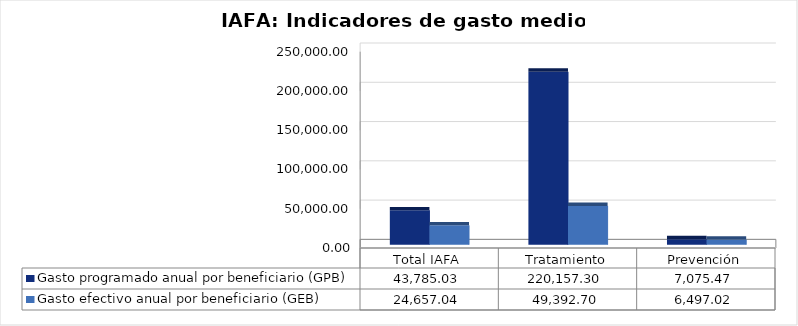
| Category | Gasto programado anual por beneficiario (GPB)  | Gasto efectivo anual por beneficiario (GEB)  |
|---|---|---|
| Total IAFA | 43785.031 | 24657.04 |
| Tratamiento | 220157.303 | 49392.699 |
| Prevención | 7075.472 | 6497.022 |